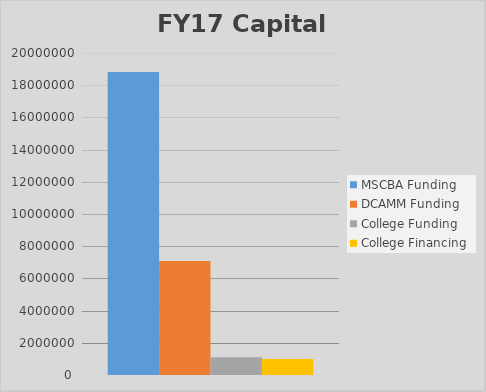
| Category | MSCBA Funding | DCAMM Funding | College Funding | College Financing |
|---|---|---|---|---|
| 0 | 18820000 | 7080000 | 1100000 | 1000000 |